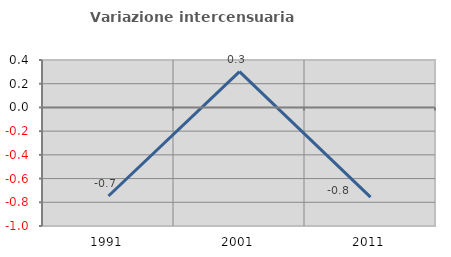
| Category | Variazione intercensuaria annua |
|---|---|
| 1991.0 | -0.747 |
| 2001.0 | 0.302 |
| 2011.0 | -0.756 |